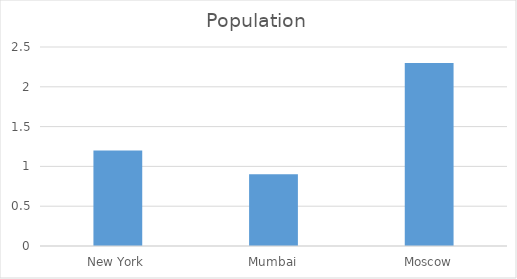
| Category | Population |
|---|---|
| New York | 1.2 |
| Mumbai | 0.9 |
| Moscow | 2.3 |